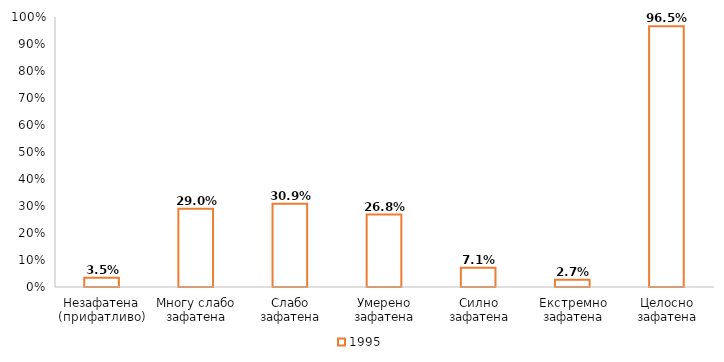
| Category | 1995 |
|---|---|
| Незафатена (прифатливо) | 0.035 |
| Многу слабо зафатена | 0.29 |
| Слабо зафатена | 0.309 |
| Умерено зафатена | 0.268 |
| Силно зафатена | 0.071 |
| Екстремно зафатена | 0.027 |
| Целосно зафатена | 0.965 |